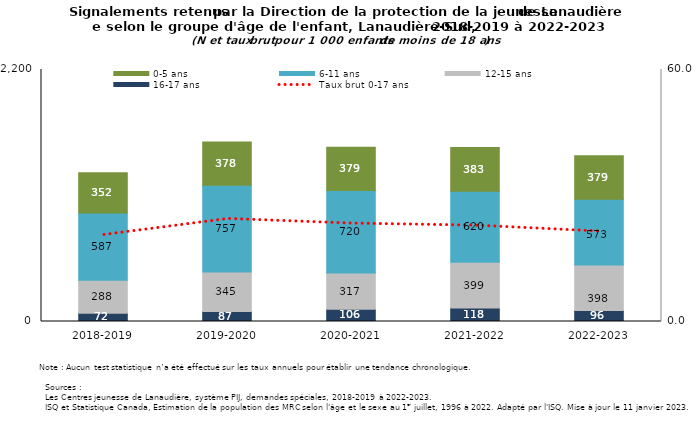
| Category | 16-17 ans | 12-15 ans | 6-11 ans | 0-5 ans |
|---|---|---|---|---|
| 2018-2019 | 72 | 288 | 587 | 352 |
| 2019-2020 | 87 | 345 | 757 | 378 |
| 2020-2021 | 106 | 317 | 720 | 379 |
| 2021-2022 | 118 | 399 | 620 | 383 |
| 2022-2023 | 96 | 398 | 573 | 379 |